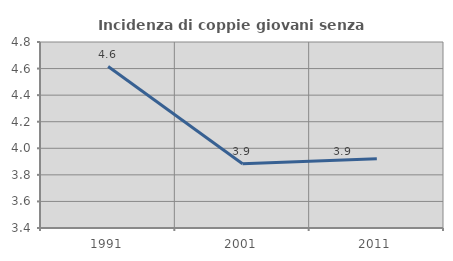
| Category | Incidenza di coppie giovani senza figli |
|---|---|
| 1991.0 | 4.615 |
| 2001.0 | 3.883 |
| 2011.0 | 3.922 |